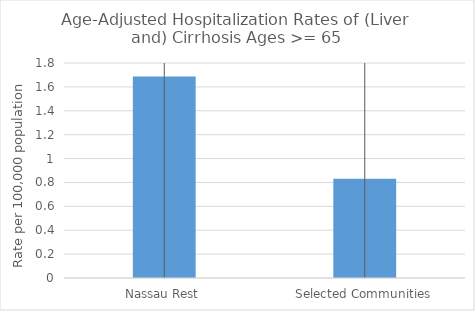
| Category | Age-Adjusted Hospitalization Rates of (Liver and) Cirrhosis Ages >= 65 |
|---|---|
| Nassau Rest | 1.686 |
| Selected Communities | 0.832 |